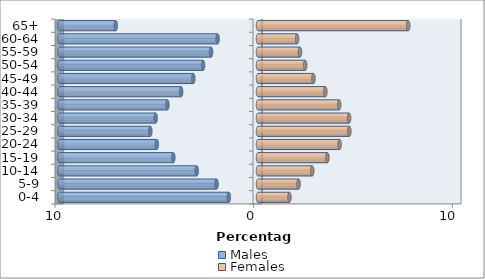
| Category | Males | Females |
|---|---|---|
| 0-4 | -1.468 | 1.584 |
| 5-9 | -2.088 | 2.043 |
| 10-14 | -3.083 | 2.731 |
| 15-19 | -4.263 | 3.493 |
| 20-24 | -5.093 | 4.111 |
| 25-29 | -5.421 | 4.597 |
| 30-34 | -5.151 | 4.585 |
| 35-39 | -4.562 | 4.086 |
| 40-44 | -3.87 | 3.39 |
| 45-49 | -3.256 | 2.791 |
| 50-54 | -2.764 | 2.375 |
| 55-59 | -2.362 | 2.113 |
| 60-64 | -2.033 | 1.969 |
| 65+ | -7.161 | 7.561 |